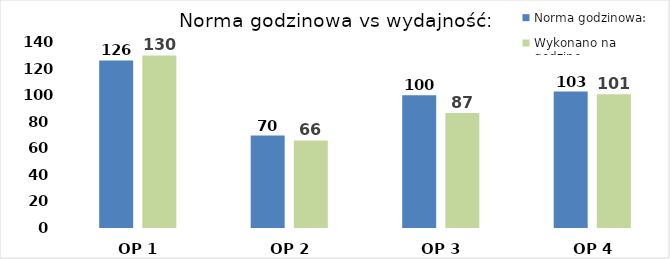
| Category | Norma godzinowa: | Wykonano na godzinę: |
|---|---|---|
| OP 1 | 126.1 | 129.9 |
| OP 2 | 69.6 | 65.9 |
| OP 3 | 100 | 86.6 |
| OP 4 | 102.7 | 100.6 |